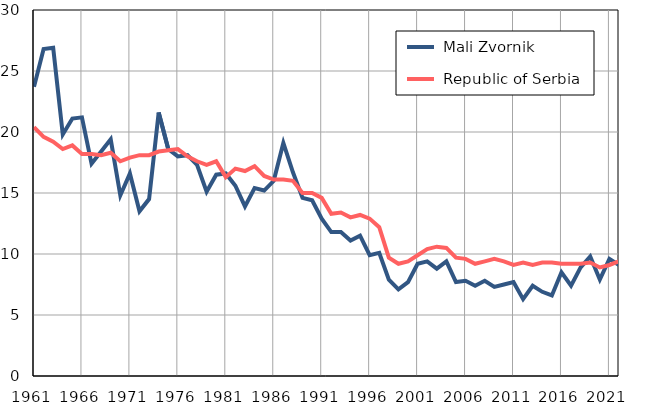
| Category |  Mali Zvornik |  Republic of Serbia |
|---|---|---|
| 1961.0 | 23.7 | 20.4 |
| 1962.0 | 26.8 | 19.6 |
| 1963.0 | 26.9 | 19.2 |
| 1964.0 | 19.8 | 18.6 |
| 1965.0 | 21.1 | 18.9 |
| 1966.0 | 21.2 | 18.2 |
| 1967.0 | 17.4 | 18.2 |
| 1968.0 | 18.4 | 18.1 |
| 1969.0 | 19.4 | 18.3 |
| 1970.0 | 14.8 | 17.6 |
| 1971.0 | 16.6 | 17.9 |
| 1972.0 | 13.5 | 18.1 |
| 1973.0 | 14.5 | 18.1 |
| 1974.0 | 21.6 | 18.4 |
| 1975.0 | 18.6 | 18.5 |
| 1976.0 | 18 | 18.6 |
| 1977.0 | 18.1 | 18 |
| 1978.0 | 17.3 | 17.6 |
| 1979.0 | 15.1 | 17.3 |
| 1980.0 | 16.5 | 17.6 |
| 1981.0 | 16.6 | 16.3 |
| 1982.0 | 15.6 | 17 |
| 1983.0 | 13.9 | 16.8 |
| 1984.0 | 15.4 | 17.2 |
| 1985.0 | 15.2 | 16.4 |
| 1986.0 | 16 | 16.1 |
| 1987.0 | 19.1 | 16.1 |
| 1988.0 | 16.7 | 16 |
| 1989.0 | 14.6 | 15 |
| 1990.0 | 14.4 | 15 |
| 1991.0 | 12.9 | 14.6 |
| 1992.0 | 11.8 | 13.3 |
| 1993.0 | 11.8 | 13.4 |
| 1994.0 | 11.1 | 13 |
| 1995.0 | 11.5 | 13.2 |
| 1996.0 | 9.9 | 12.9 |
| 1997.0 | 10.1 | 12.2 |
| 1998.0 | 7.9 | 9.7 |
| 1999.0 | 7.1 | 9.2 |
| 2000.0 | 7.7 | 9.4 |
| 2001.0 | 9.2 | 9.9 |
| 2002.0 | 9.4 | 10.4 |
| 2003.0 | 8.8 | 10.6 |
| 2004.0 | 9.4 | 10.5 |
| 2005.0 | 7.7 | 9.7 |
| 2006.0 | 7.8 | 9.6 |
| 2007.0 | 7.4 | 9.2 |
| 2008.0 | 7.8 | 9.4 |
| 2009.0 | 7.3 | 9.6 |
| 2010.0 | 7.5 | 9.4 |
| 2011.0 | 7.7 | 9.1 |
| 2012.0 | 6.3 | 9.3 |
| 2013.0 | 7.4 | 9.1 |
| 2014.0 | 6.9 | 9.3 |
| 2015.0 | 6.6 | 9.3 |
| 2016.0 | 8.5 | 9.2 |
| 2017.0 | 7.4 | 9.2 |
| 2018.0 | 8.9 | 9.2 |
| 2019.0 | 9.8 | 9.3 |
| 2020.0 | 7.9 | 8.9 |
| 2021.0 | 9.6 | 9.1 |
| 2022.0 | 9.1 | 9.4 |